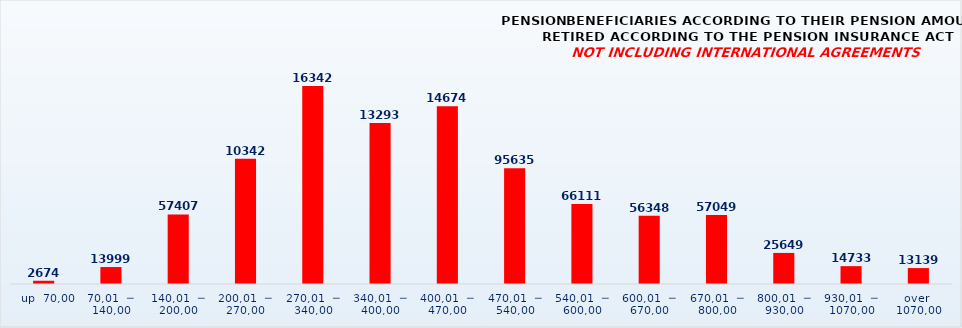
| Category | PENSION BENEFICIARIES ACCORDING TO TYPES AND AMOUNTS OF PENSION, RETIRED ACCORDING TO THE PENSION INSURANCE ACT
NOT INCLUDING INTERNATIONAL AGREEMENTS |
|---|---|
|   up  70,00 | 2674 |
| 70,01  ─  140,00 | 13999 |
| 140,01  ─  200,00 | 57407 |
| 200,01  ─  270,00 | 103428 |
| 270,01  ─  340,00 | 163422 |
| 340,01  ─  400,00 | 132933 |
| 400,01  ─  470,00 | 146743 |
| 470,01  ─  540,00 | 95635 |
| 540,01  ─  600,00 | 66111 |
| 600,01  ─  670,00 | 56348 |
| 670,01  ─  800,00 | 57049 |
| 800,01  ─  930,00 | 25649 |
| 930,01  ─  1070,00 | 14733 |
| over  1070,00 | 13139 |